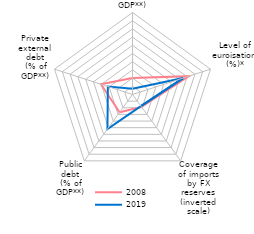
| Category | 2008 | 2019 |
|---|---|---|
| Current account deficit
(% of GDP**) | 20 | 6.9 |
| Level of
euroisation
(%)* | 72.4 | 64.9 |
| Coverage of imports by FX reserves
(inverted scale) | 18.651 | 17.4 |
| Public debt
(% of GDP**) | 26.8 | 52 |
| Private
external debt
(% of GDP**) | 40.4 | 31.6 |